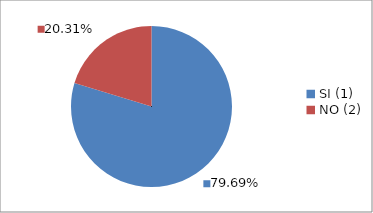
| Category | Series 0 |
|---|---|
| SI (1) | 0.797 |
| NO (2) | 0.203 |